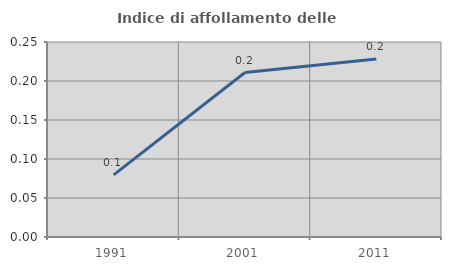
| Category | Indice di affollamento delle abitazioni  |
|---|---|
| 1991.0 | 0.08 |
| 2001.0 | 0.211 |
| 2011.0 | 0.228 |